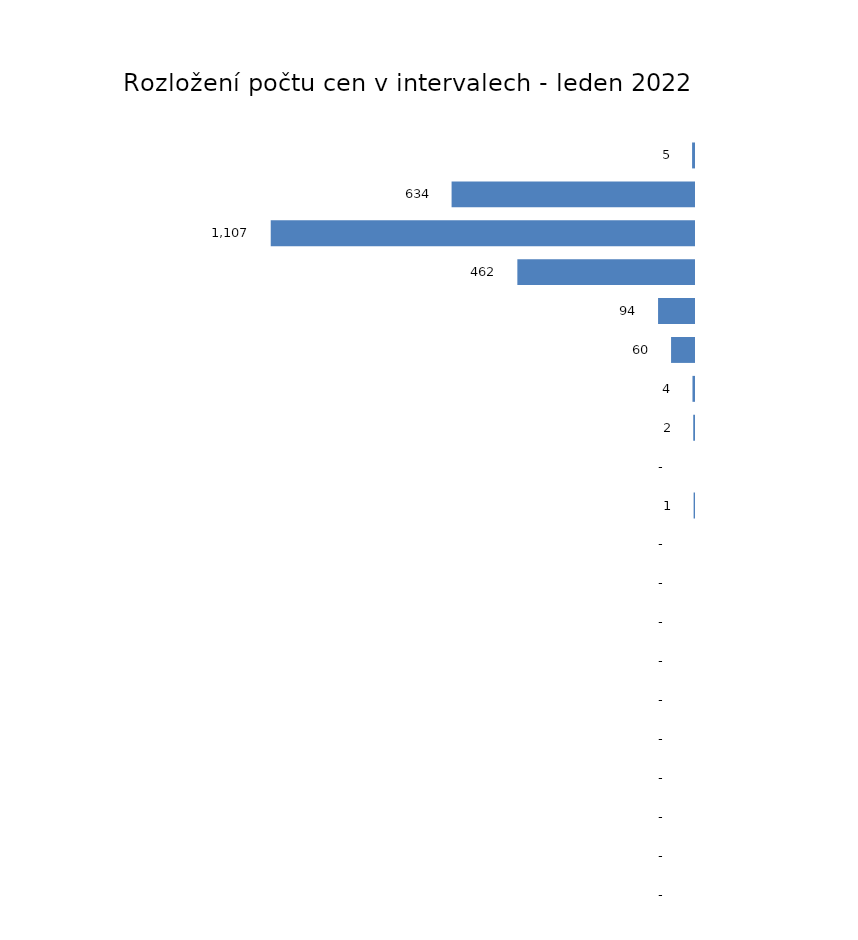
| Category | Rozložení počtu cen v intervalech - leden |
|---|---|
| ( 0 - 250 > | 5 |
| ( 250 - 500 > | 634 |
| ( 500 - 750 > | 1107 |
| ( 750 - 1000 > | 462 |
| ( 1000 - 1250 > | 94 |
| ( 1250 - 1500 > | 60 |
| ( 1500 - 1750 > | 4 |
| ( 1750 - 2000 > | 2 |
| ( 2000 - 2250 > | 0 |
| ( 2250 - 2500 > | 1 |
| ( 2500 - 2750 > | 0 |
| ( 2750 - 3000 > | 0 |
| ( 3000 - 3250 > | 0 |
| ( 3250 - 3500 > | 0 |
| ( 3500 - 3750 > | 0 |
| ( 3750 - 4000 > | 0 |
| ( 4000 - 4250 > | 0 |
| ( 4250 - 4500 > | 0 |
| ( 4500 - 4750 > | 0 |
| ( 4750 - 5000 > | 0 |